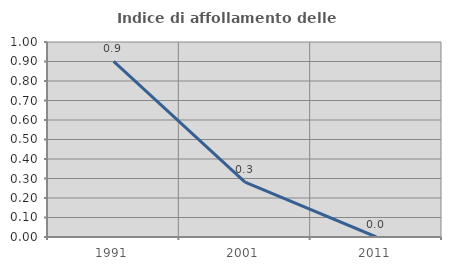
| Category | Indice di affollamento delle abitazioni  |
|---|---|
| 1991.0 | 0.901 |
| 2001.0 | 0.282 |
| 2011.0 | 0 |